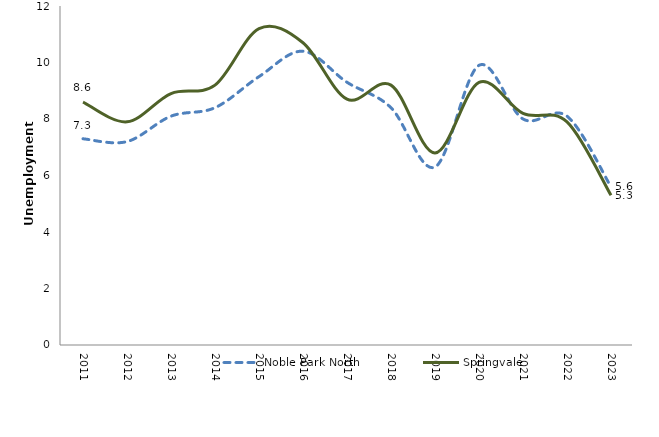
| Category | Noble Park North | Springvale |
|---|---|---|
| 2011.0 | 7.3 | 8.6 |
| 2012.0 | 7.2 | 7.9 |
| 2013.0 | 8.1 | 8.9 |
| 2014.0 | 8.4 | 9.2 |
| 2015.0 | 9.5 | 11.2 |
| 2016.0 | 10.4 | 10.7 |
| 2017.0 | 9.3 | 8.7 |
| 2018.0 | 8.4 | 9.2 |
| 2019.0 | 6.3 | 6.8 |
| 2020.0 | 9.9 | 9.3 |
| 2021.0 | 8 | 8.2 |
| 2022.0 | 8.1 | 7.9 |
| 2023.0 | 5.6 | 5.3 |